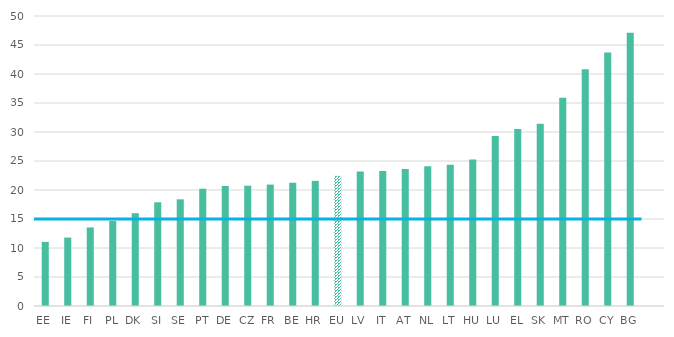
| Category | 2018 |
|---|---|
| 0 | 11.054 |
| 1 | 11.799 |
| 2 | 13.545 |
| 3 | 14.676 |
| 4 | 16 |
| 5 | 17.881 |
| 6 | 18.393 |
| 7 | 20.222 |
| 8 | 20.685 |
| 9 | 20.74 |
| 10 | 20.937 |
| 11 | 21.253 |
| 12 | 21.579 |
| 13 | 22.459 |
| 14 | 23.201 |
| 15 | 23.267 |
| 16 | 23.623 |
| 17 | 24.087 |
| 18 | 24.363 |
| 19 | 25.274 |
| 20 | 29.291 |
| 21 | 30.516 |
| 22 | 31.41 |
| 23 | 35.886 |
| 24 | 40.838 |
| 25 | 43.708 |
| 26 | 47.103 |